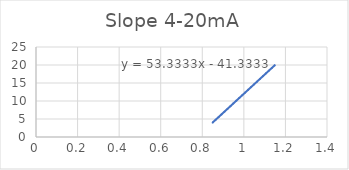
| Category | Series 0 |
|---|---|
| 0.85 | 4 |
| 1.15 | 20 |